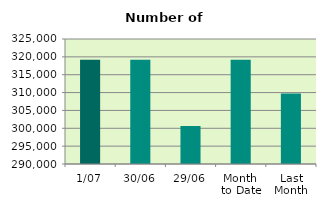
| Category | Series 0 |
|---|---|
| 1/07 | 319210 |
| 30/06 | 319180 |
| 29/06 | 300634 |
| Month 
to Date | 319210 |
| Last
Month | 309731.364 |